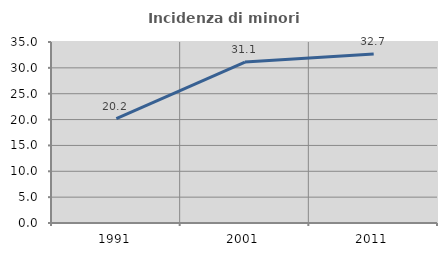
| Category | Incidenza di minori stranieri |
|---|---|
| 1991.0 | 20.202 |
| 2001.0 | 31.127 |
| 2011.0 | 32.665 |